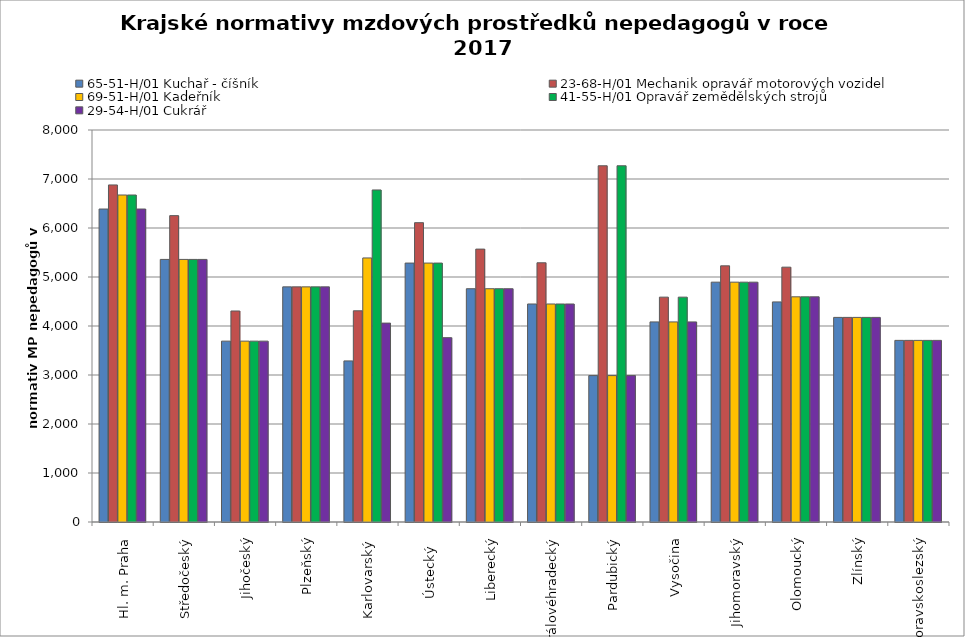
| Category | 65-51-H/01 Kuchař - číšník | 23-68-H/01 Mechanik opravář motorových vozidel | 69-51-H/01 Kadeřník | 41-55-H/01 Opravář zemědělských strojů | 29-54-H/01 Cukrář |
|---|---|---|---|---|---|
| Hl. m. Praha | 6387.429 | 6878.769 | 6673.433 | 6673.433 | 6387.429 |
| Středočeský | 5358.894 | 6252.308 | 5358.894 | 5358.894 | 5358.894 |
| Jihočeský | 3691.068 | 4306.393 | 3691.068 | 3691.068 | 3691.068 |
| Plzeňský | 4798.558 | 4798.558 | 4798.558 | 4798.558 | 4798.558 |
| Karlovarský  | 3287.377 | 4310.163 | 5388.905 | 6776.158 | 4059.253 |
| Ústecký   | 5284.339 | 6108.424 | 5284.339 | 5284.339 | 3761.822 |
| Liberecký | 4760.525 | 5569.454 | 4760.525 | 4760.525 | 4760.525 |
| Královéhradecký | 4449.118 | 5290.132 | 4449.118 | 4449.118 | 4449.118 |
| Pardubický | 2987.671 | 7270 | 2987.671 | 7270 | 2987.671 |
| Vysočina | 4083.305 | 4588.781 | 4083.305 | 4588.781 | 4083.305 |
| Jihomoravský | 4894.525 | 5227.831 | 4894.525 | 4894.525 | 4894.525 |
| Olomoucký | 4491.452 | 5200.628 | 4595.373 | 4595.373 | 4595.373 |
| Zlínský | 4175.51 | 4175.51 | 4175.51 | 4175.51 | 4175.51 |
| Moravskoslezský | 3706.47 | 3706.47 | 3706.47 | 3706.47 | 3706.47 |